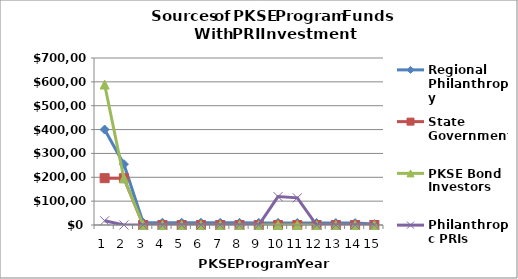
| Category | Regional Philanthropy | State Government | PKSE Bond Investors | Philanthropic PRIs |
|---|---|---|---|---|
| 0 | 400000 | 196250 | 588750 | 17662.5 |
| 1 | 255000 | 196250 | 196250 | 0 |
| 2 | 9900 | 0 | 0 | 0 |
| 3 | 9702 | 0 | 0 | 0 |
| 4 | 9507.96 | 0 | 0 | 0 |
| 5 | 9317.801 | 0 | 0 | 0 |
| 6 | 9131.445 | 0 | 0 | 0 |
| 7 | 8948.816 | 0 | 0 | 0 |
| 8 | 8769.84 | 0 | 0 | 0 |
| 9 | 8594.443 | 0 | 0 | 118960.302 |
| 10 | 8422.554 | 0 | 0 | 113699.127 |
| 11 | 8254.103 | 0 | 0 | 0 |
| 12 | 8089.021 | 0 | 0 | 0 |
| 13 | 7927.24 | 0 | 0 | 0 |
| 14 | 3923.584 | 0 | 0 | 0 |